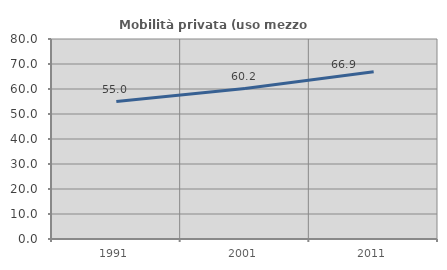
| Category | Mobilità privata (uso mezzo privato) |
|---|---|
| 1991.0 | 54.968 |
| 2001.0 | 60.175 |
| 2011.0 | 66.883 |